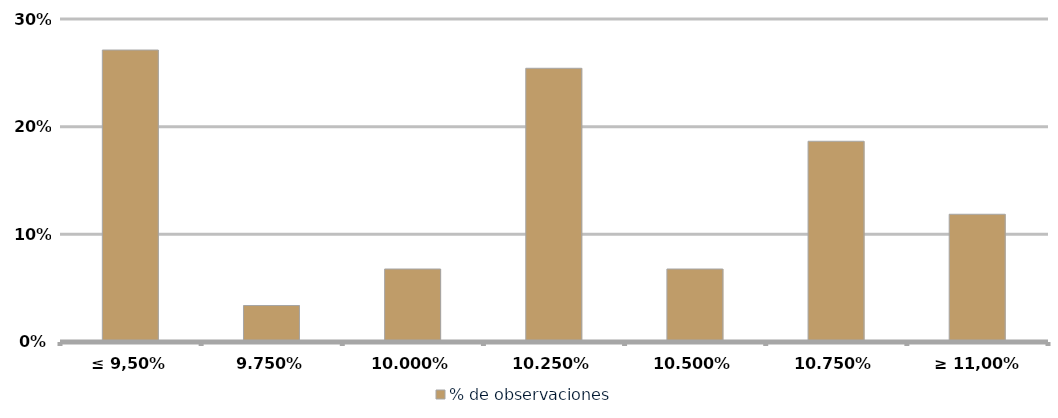
| Category | % de observaciones  |
|---|---|
| ≤ 9,50% | 0.271 |
| 9,75% | 0.034 |
| 10,00% | 0.068 |
| 10,25% | 0.254 |
| 10,50% | 0.068 |
| 10,75% | 0.186 |
| ≥ 11,00% | 0.119 |